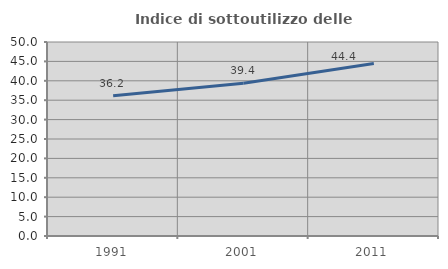
| Category | Indice di sottoutilizzo delle abitazioni  |
|---|---|
| 1991.0 | 36.173 |
| 2001.0 | 39.389 |
| 2011.0 | 44.439 |